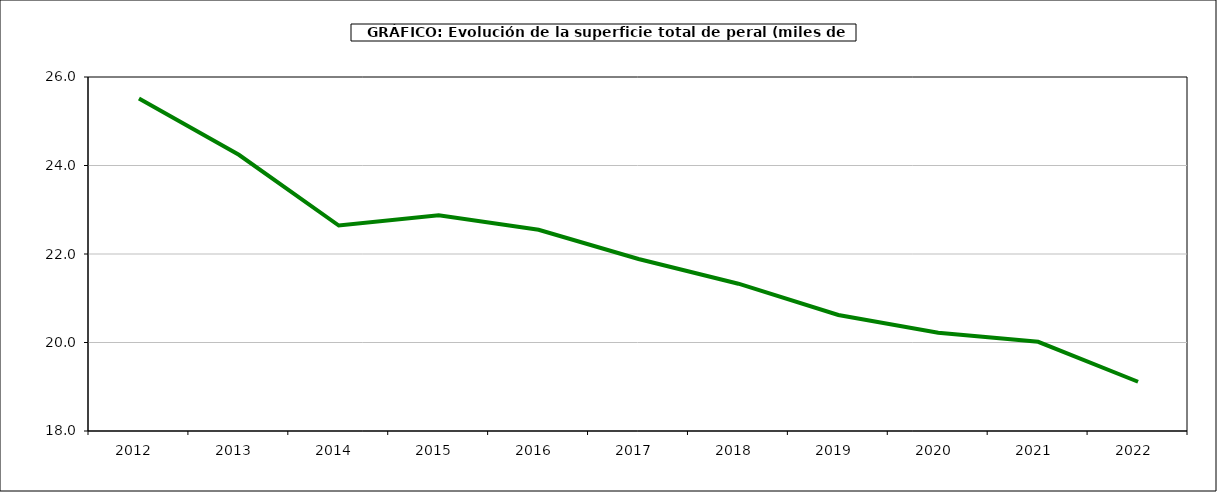
| Category | superficie peral |
|---|---|
| 2012.0 | 25.512 |
| 2013.0 | 24.243 |
| 2014.0 | 22.643 |
| 2015.0 | 22.878 |
| 2016.0 | 22.547 |
| 2017.0 | 21.888 |
| 2018.0 | 21.329 |
| 2019.0 | 20.623 |
| 2020.0 | 20.221 |
| 2021.0 | 20.015 |
| 2022.0 | 19.113 |